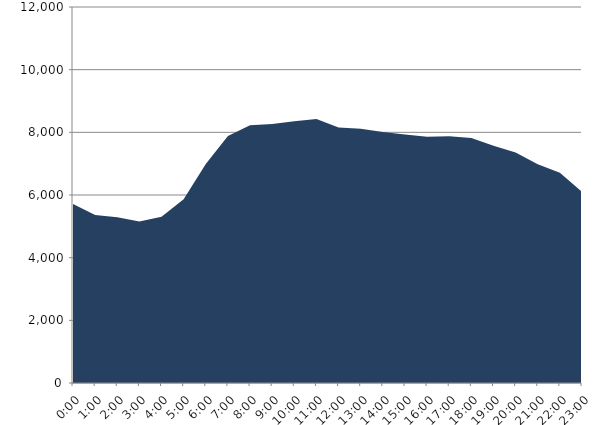
| Category | Series 0 | Series 1 |
|---|---|---|
| 2018-05-16 |  | 5713.2 |
| 2018-05-16 01:00:00 |  | 5364.98 |
| 2018-05-16 02:00:00 |  | 5287.41 |
| 2018-05-16 03:00:00 |  | 5152.67 |
| 2018-05-16 04:00:00 |  | 5304.02 |
| 2018-05-16 05:00:00 |  | 5864.51 |
| 2018-05-16 06:00:00 |  | 6988.55 |
| 2018-05-16 07:00:00 |  | 7885.55 |
| 2018-05-16 08:00:00 |  | 8226.35 |
| 2018-05-16 09:00:00 |  | 8262.02 |
| 2018-05-16 10:00:00 |  | 8352.31 |
| 2018-05-16 11:00:00 |  | 8428.14 |
| 2018-05-16 12:00:00 |  | 8157.75 |
| 2018-05-16 13:00:00 |  | 8118.3 |
| 2018-05-16 14:00:00 |  | 8009.58 |
| 2018-05-16 15:00:00 |  | 7929.44 |
| 2018-05-16 16:00:00 |  | 7861.19 |
| 2018-05-16 17:00:00 |  | 7876.62 |
| 2018-05-16 18:00:00 |  | 7820.82 |
| 2018-05-16 19:00:00 |  | 7570.3 |
| 2018-05-16 20:00:00 |  | 7352.59 |
| 2018-05-16 21:00:00 |  | 6978.11 |
| 2018-05-16 22:00:00 |  | 6706.79 |
| 2018-05-16 23:00:00 |  | 6101.97 |